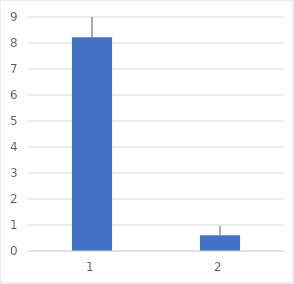
| Category | Series 0 |
|---|---|
| 0 | 8.218 |
| 1 | 0.607 |